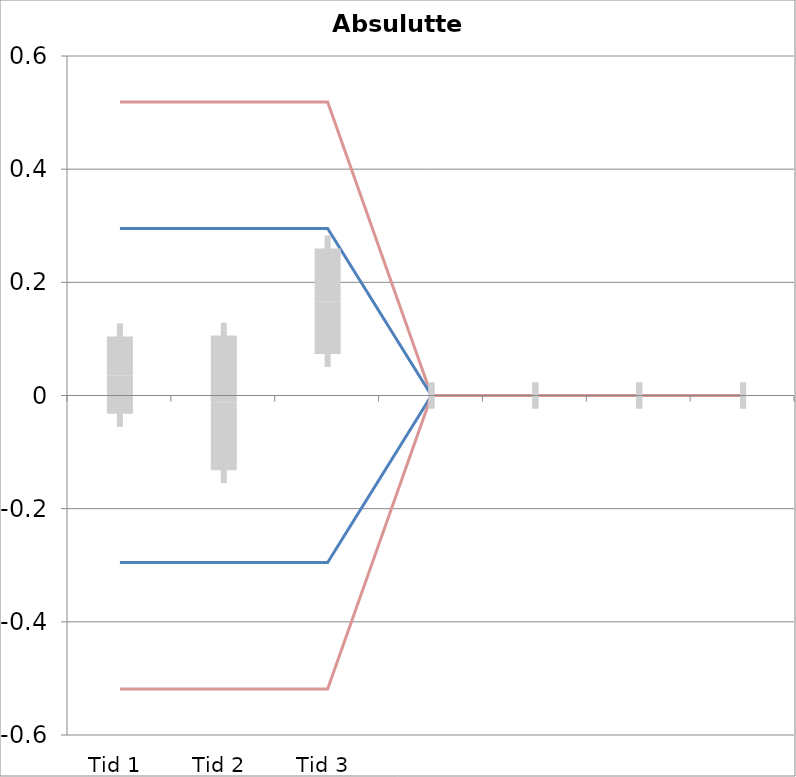
| Category | 1 | 2 | 3 | 4 | 5 | 6 | 7 | 8 | 9 | 10 | 11 | 12 | 13 | 14 | 15 | 16 | 17 | 18 | 19 | 20 | TEa | B | -B | -TEa | M |
|---|---|---|---|---|---|---|---|---|---|---|---|---|---|---|---|---|---|---|---|---|---|---|---|---|---|
| Tid 1 | 0.02 | 0.1 | 0.05 | 0.1 | -0.12 | 0.19 | 0.03 | -0.03 | -0.09 | 0.11 | 0 | 0 | 0 | 0 | 0 | 0 | 0 | 0 | 0 | 0 | 0.519 | 0.295 | -0.295 | -0.519 | 0.036 |
| Tid 2 | 0.06 | -0.23 | 0.07 | -0.1 | 0.04 | 0.3 | -0.23 | 0.11 | -0.15 | 0 | 0 | 0 | 0 | 0 | 0 | 0 | 0 | 0 | 0 | 0 | 0.519 | 0.295 | -0.295 | -0.519 | -0.013 |
| Tid 3 | 0.06 | 0.27 | 0 | 0.1 | 0.24 | 0.3 | 0.17 | 0.11 | -0.05 | 0.3 | 0 | 0 | 0 | 0 | 0 | 0 | 0 | 0 | 0 | 0 | 0.519 | 0.295 | -0.295 | -0.519 | 0.167 |